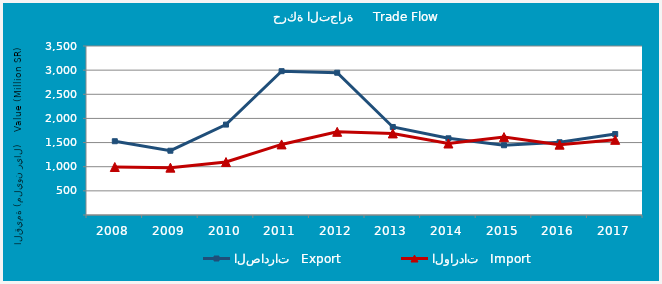
| Category | الصادرات   Export | الواردات   Import |
|---|---|---|
| 2008.0 | 1527858212 | 993935543 |
| 2009.0 | 1331023979 | 980251837 |
| 2010.0 | 1872544592 | 1096963944 |
| 2011.0 | 2978607759 | 1461837415 |
| 2012.0 | 2946562908 | 1722646066 |
| 2013.0 | 1823065192 | 1689339070 |
| 2014.0 | 1588337909 | 1480564629 |
| 2015.0 | 1444633704 | 1613279912 |
| 2016.0 | 1506429749 | 1456751612 |
| 2017.0 | 1676532310 | 1556563002 |